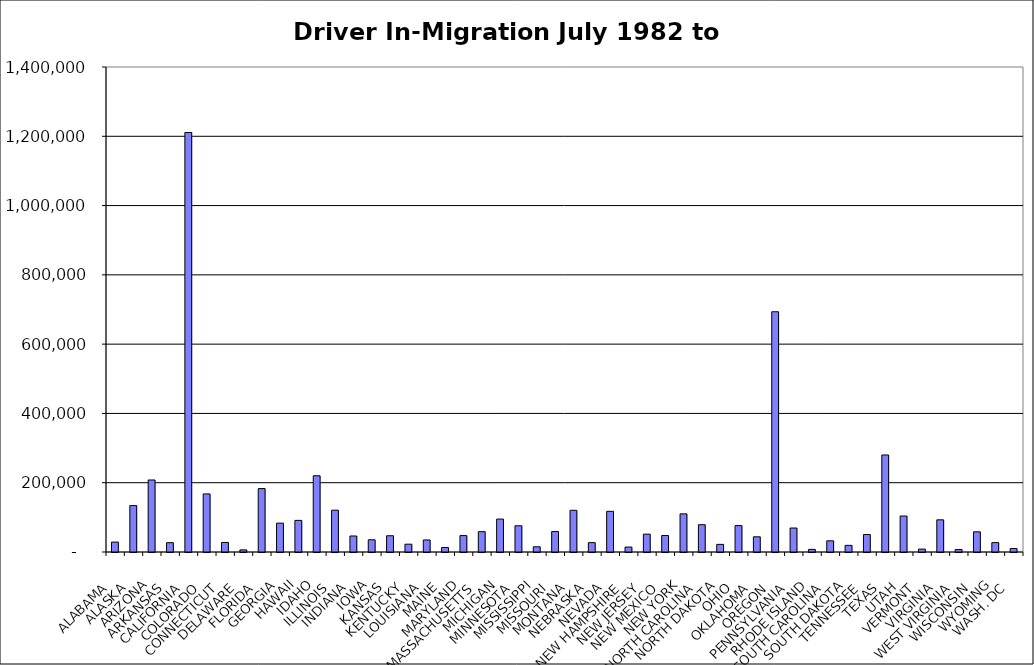
| Category | Series 0 |
|---|---|
|  ALABAMA  | 28610.5 |
|  ALASKA  | 133927.5 |
|  ARIZONA  | 207865 |
|  ARKANSAS  | 26963.5 |
|  CALIFORNIA  | 1210913.5 |
|  COLORADO  | 167641 |
|  CONNECTICUT  | 27571 |
|  DELAWARE  | 6106.5 |
|  FLORIDA  | 183030 |
|  GEORGIA  | 83338 |
|  HAWAII  | 91287.5 |
|  IDAHO  | 220094.5 |
|  ILLINOIS  | 120610.5 |
|  INDIANA  | 46221 |
|  IOWA  | 35181.5 |
|  KANSAS  | 46909.5 |
|  KENTUCKY  | 22588 |
|  LOUISIANA  | 34730.5 |
|  MAINE  | 13072.5 |
|  MARYLAND  | 47396 |
|  MASSACHUSETTS  | 58707 |
|  MICHIGAN  | 95082 |
|  MINNESOTA  | 75716.5 |
|  MISSISSIPPI  | 15095 |
|  MISSOURI  | 59101 |
|  MONTANA  | 120407 |
|  NEBRASKA  | 26974.5 |
|  NEVADA  | 117374 |
|  NEW HAMPSHIRE  | 14248.5 |
|  NEW JERSEY  | 51533 |
|  NEW MEXICO  | 47570 |
|  NEW YORK  | 110092 |
|  NORTH CAROLINA  | 78824.5 |
|  NORTH DAKOTA  | 22029.5 |
|  OHIO  | 76254.5 |
|  OKLAHOMA  | 43842 |
|  OREGON  | 693521 |
|  PENNSYLVANIA  | 69206.5 |
|  RHODE ISLAND  | 7495 |
|  SOUTH CAROLINA  | 32224.5 |
|  SOUTH DAKOTA  | 19165.5 |
|  TENNESSEE  | 50404.5 |
|  TEXAS  | 280012 |
|  UTAH  | 103874.5 |
|  VERMONT  | 8358 |
|  VIRGINIA  | 92894 |
|  WEST VIRGINIA  | 7064.5 |
|  WISCONSIN  | 58242.5 |
|  WYOMING  | 27073 |
|  WASH. DC  | 9905 |